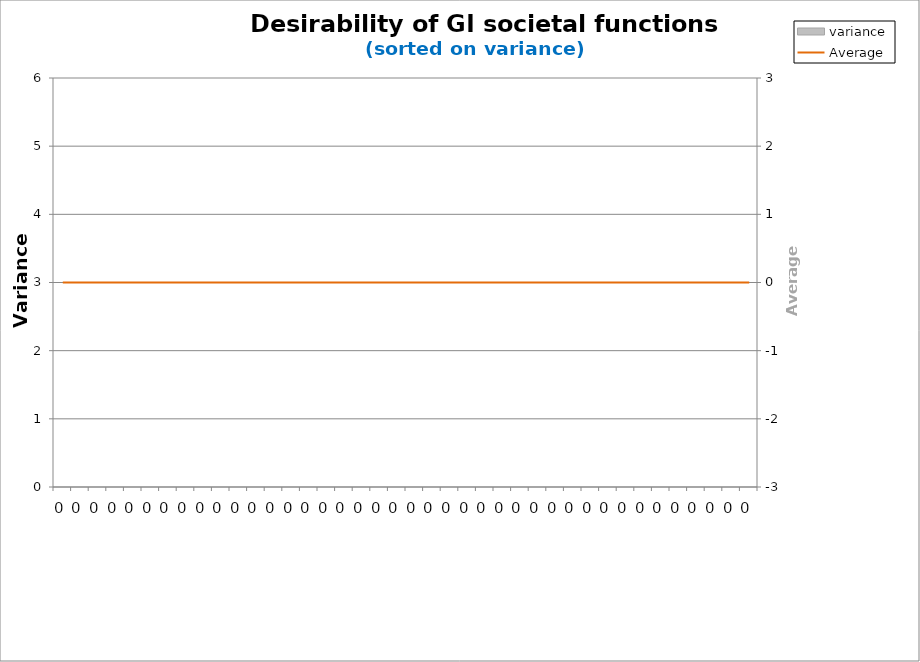
| Category | variance |
|---|---|
| 0.0 | 0 |
| 0.0 | 0 |
| 0.0 | 0 |
| 0.0 | 0 |
| 0.0 | 0 |
| 0.0 | 0 |
| 0.0 | 0 |
| 0.0 | 0 |
| 0.0 | 0 |
| 0.0 | 0 |
| 0.0 | 0 |
| 0.0 | 0 |
| 0.0 | 0 |
| 0.0 | 0 |
| 0.0 | 0 |
| 0.0 | 0 |
| 0.0 | 0 |
| 0.0 | 0 |
| 0.0 | 0 |
| 0.0 | 0 |
| 0.0 | 0 |
| 0.0 | 0 |
| 0.0 | 0 |
| 0.0 | 0 |
| 0.0 | 0 |
| 0.0 | 0 |
| 0.0 | 0 |
| 0.0 | 0 |
| 0.0 | 0 |
| 0.0 | 0 |
| 0.0 | 0 |
| 0.0 | 0 |
| 0.0 | 0 |
| 0.0 | 0 |
| 0.0 | 0 |
| 0.0 | 0 |
| 0.0 | 0 |
| 0.0 | 0 |
| 0.0 | 0 |
| 0.0 | 0 |